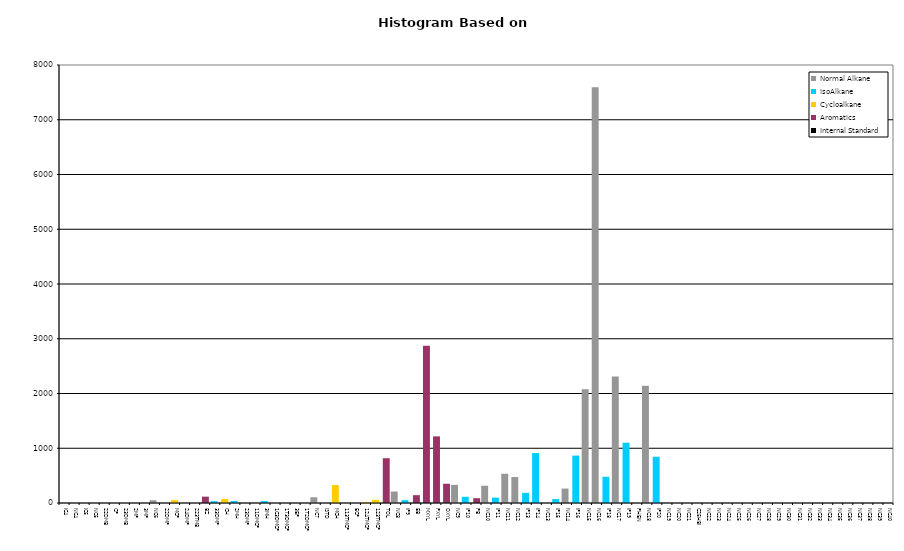
| Category | Normal Alkane | IsoAlkane | Cycloalkane | Aromatics | Internal Standard |
|---|---|---|---|---|---|
| IC4 | 0 | 0 | 0 | 0 | 0 |
| NC4 | 0 | 0 | 0 | 0 | 0 |
| IC5 | 0 | 0 | 0 | 0 | 0 |
| NC5 | 0 | 0 | 0 | 0 | 0 |
| 22DMB | 0 | 0 | 0 | 0 | 0 |
| CP | 0 | 0 | 0 | 0 | 0 |
| 23DMB | 0 | 0 | 0 | 0 | 0 |
| 2MP | 0 | 0 | 0 | 0 | 0 |
| 3MP | 0 | 0 | 0 | 0 | 0 |
| NC6 | 50 | 0 | 0 | 0 | 0 |
| 22DMP | 0 | 0 | 0 | 0 | 0 |
| MCP | 0 | 0 | 53 | 0 | 0 |
| 24DMP | 0 | 0 | 0 | 0 | 0 |
| 223TMB | 0 | 0 | 0 | 0 | 0 |
| BZ | 0 | 0 | 0 | 116 | 0 |
| 33DMP | 0 | 33 | 0 | 0 | 0 |
| CH | 0 | 0 | 74 | 0 | 0 |
| 2MH | 0 | 37 | 0 | 0 | 0 |
| 23DMP | 0 | 0 | 0 | 0 | 0 |
| 11DMCP | 0 | 0 | 0 | 0 | 0 |
| 3MH | 0 | 37 | 0 | 0 | 0 |
| 1C3DMCP | 0 | 0 | 0 | 0 | 0 |
| 1T3DMCP | 0 | 0 | 0 | 0 | 0 |
| 3EP | 0 | 0 | 0 | 0 | 0 |
| 1T2DMCP | 0 | 0 | 0 | 0 | 0 |
| NC7 | 104 | 0 | 0 | 0 | 0 |
| ISTD | 0 | 0 | 0 | 0 | 0 |
| MCH | 0 | 0 | 328 | 0 | 0 |
| 113TMCP | 0 | 0 | 0 | 0 | 0 |
| ECP | 0 | 0 | 0 | 0 | 0 |
| 124TMCP | 0 | 0 | 19 | 0 | 0 |
| 123TMCP | 0 | 0 | 58 | 0 | 0 |
| TOL | 0 | 0 | 0 | 818 | 0 |
| NC8 | 209 | 0 | 0 | 0 | 0 |
| IP9 | 0 | 52 | 0 | 0 | 0 |
| EB | 0 | 0 | 0 | 143 | 0 |
| MXYL | 0 | 0 | 0 | 2873 | 0 |
| PXYL | 0 | 0 | 0 | 1217 | 0 |
| OXYL | 0 | 0 | 0 | 352 | 0 |
| NC9 | 331 | 0 | 0 | 0 | 0 |
| IP10 | 0 | 113 | 0 | 0 | 0 |
| PB | 0 | 0 | 0 | 88 | 0 |
| NC10 | 315 | 0 | 0 | 0 | 0 |
| IP11 | 0 | 98 | 0 | 0 | 0 |
| NC11 | 534 | 0 | 0 | 0 | 0 |
| NC12 | 474 | 0 | 0 | 0 | 0 |
| IP13 | 0 | 185 | 0 | 0 | 0 |
| IP14 | 0 | 912 | 0 | 0 | 0 |
| NC13 | 0 | 0 | 0 | 0 | 0 |
| IP15 | 0 | 72 | 0 | 0 | 0 |
| NC14 | 264 | 0 | 0 | 0 | 0 |
| IP16 | 0 | 866 | 0 | 0 | 0 |
| NC15 | 2078 | 0 | 0 | 0 | 0 |
| NC16 | 7593 | 0 | 0 | 0 | 0 |
| IP18 | 0 | 479 | 0 | 0 | 0 |
| NC17 | 2310 | 0 | 0 | 0 | 0 |
| IP19 | 0 | 1101 | 0 | 0 | 0 |
| PHEN | 0 | 0 | 0 | 0 | 0 |
| NC18 | 2141 | 0 | 0 | 0 | 0 |
| IP20 | 0 | 845 | 0 | 0 | 0 |
| NC19 | 0 | 0 | 0 | 0 | 0 |
| NC20 | 0 | 0 | 0 | 0 | 0 |
| NC21 | 0 | 0 | 0 | 0 | 0 |
| C25HBI | 0 | 0 | 0 | 0 | 0 |
| NC22 | 0 | 0 | 0 | 0 | 0 |
| NC23 | 0 | 0 | 0 | 0 | 0 |
| NC24 | 0 | 0 | 0 | 0 | 0 |
| NC25 | 0 | 0 | 0 | 0 | 0 |
| NC26 | 0 | 0 | 0 | 0 | 0 |
| NC27 | 0 | 0 | 0 | 0 | 0 |
| NC28 | 0 | 0 | 0 | 0 | 0 |
| NC29 | 0 | 0 | 0 | 0 | 0 |
| NC30 | 0 | 0 | 0 | 0 | 0 |
| NC31 | 0 | 0 | 0 | 0 | 0 |
| NC32 | 0 | 0 | 0 | 0 | 0 |
| NC33 | 0 | 0 | 0 | 0 | 0 |
| NC34 | 0 | 0 | 0 | 0 | 0 |
| NC35 | 0 | 0 | 0 | 0 | 0 |
| NC36 | 0 | 0 | 0 | 0 | 0 |
| NC37 | 0 | 0 | 0 | 0 | 0 |
| NC38 | 0 | 0 | 0 | 0 | 0 |
| NC39 | 0 | 0 | 0 | 0 | 0 |
| NC40 | 0 | 0 | 0 | 0 | 0 |